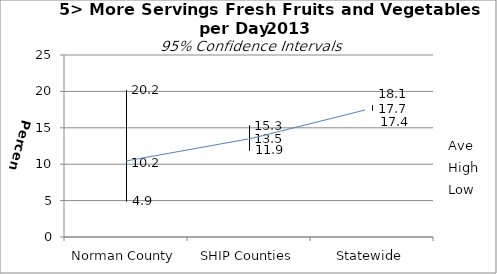
| Category | Ave | High | Low |
|---|---|---|---|
| Norman County | 10.2 | 20.2 | 4.9 |
| SHIP Counties | 13.5 | 15.3 | 11.9 |
| Statewide | 17.7 | 18.1 | 17.4 |